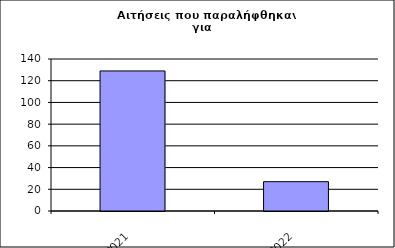
| Category | Series 0 |
|---|---|
| 2021.0 | 129 |
| 2022.0 | 27 |